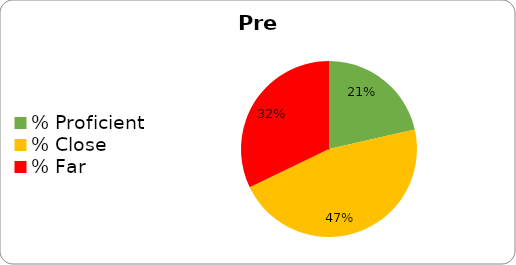
| Category | Series 0 |
|---|---|
| % Proficient | 0.214 |
| % Close | 0.464 |
| % Far | 0.321 |